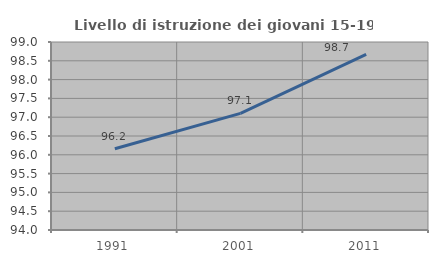
| Category | Livello di istruzione dei giovani 15-19 anni |
|---|---|
| 1991.0 | 96.163 |
| 2001.0 | 97.101 |
| 2011.0 | 98.67 |